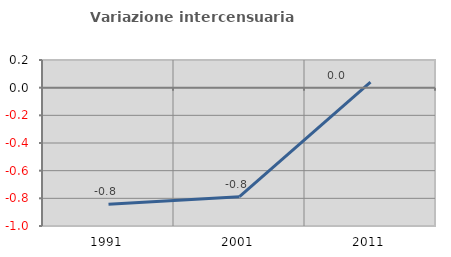
| Category | Variazione intercensuaria annua |
|---|---|
| 1991.0 | -0.843 |
| 2001.0 | -0.788 |
| 2011.0 | 0.041 |